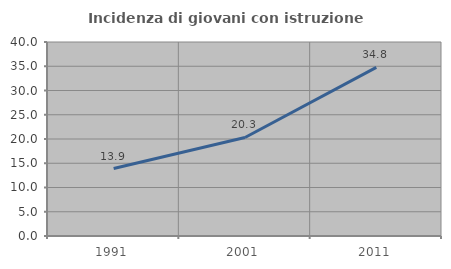
| Category | Incidenza di giovani con istruzione universitaria |
|---|---|
| 1991.0 | 13.909 |
| 2001.0 | 20.318 |
| 2011.0 | 34.766 |